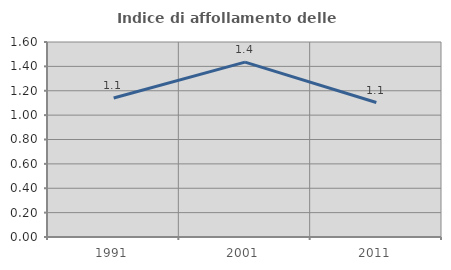
| Category | Indice di affollamento delle abitazioni  |
|---|---|
| 1991.0 | 1.141 |
| 2001.0 | 1.435 |
| 2011.0 | 1.103 |